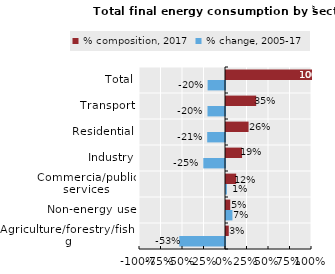
| Category | % composition, 2017 | % change, 2005-17 |
|---|---|---|
| Total | 1 | -0.202 |
| Transport | 0.351 | -0.204 |
| Residential | 0.262 | -0.207 |
| Industry | 0.187 | -0.252 |
| Commercia/public services | 0.118 | 0.01 |
| Non-energy use | 0.049 | 0.075 |
| Agriculture/forestry/fishing | 0.032 | -0.532 |